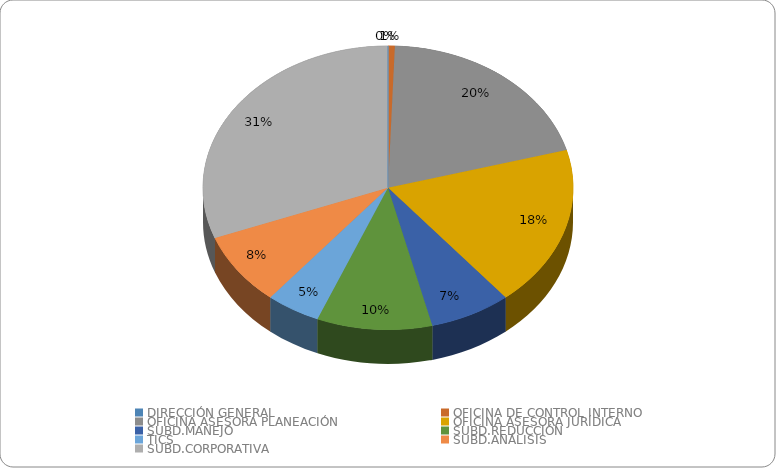
| Category | HALLAZGOS TOTALES |
|---|---|
| DIRECCIÓN GENERAL | 0 |
| OFICINA DE CONTROL INTERNO | 1 |
| OFICINA ASESORA PLANEACIÓN | 34 |
| OFICINA ASESORA JURÍDICA | 31 |
| SUBD.MANEJO | 12 |
| SUBD.REDUCCIÓN | 17 |
| TICS | 8 |
| SUBD.ANÁLISIS | 14 |
| SUBD.CORPORATIVA | 52 |